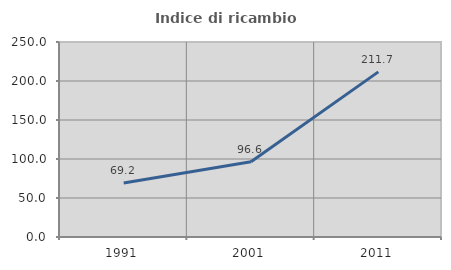
| Category | Indice di ricambio occupazionale  |
|---|---|
| 1991.0 | 69.215 |
| 2001.0 | 96.588 |
| 2011.0 | 211.692 |